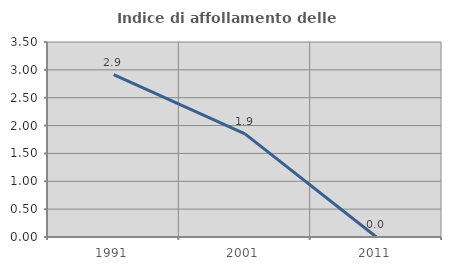
| Category | Indice di affollamento delle abitazioni  |
|---|---|
| 1991.0 | 2.913 |
| 2001.0 | 1.852 |
| 2011.0 | 0 |